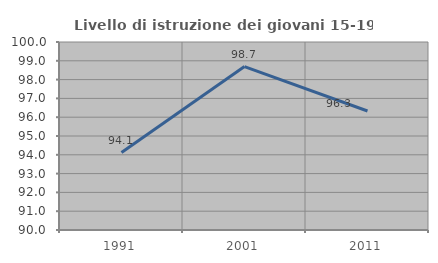
| Category | Livello di istruzione dei giovani 15-19 anni |
|---|---|
| 1991.0 | 94.118 |
| 2001.0 | 98.693 |
| 2011.0 | 96.33 |